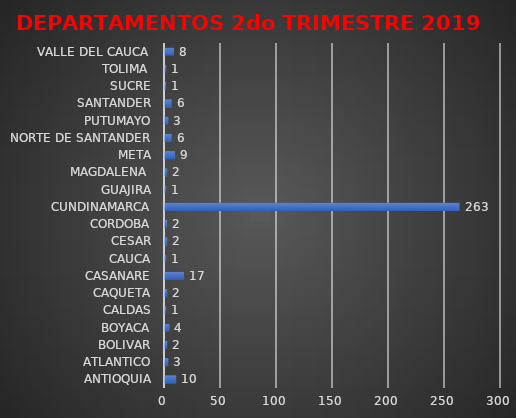
| Category | Series 0 |
|---|---|
| ANTIOQUIA | 10 |
| ATLANTICO | 3 |
| BOLIVAR | 2 |
| BOYACA | 4 |
| CALDAS | 1 |
| CAQUETA | 2 |
| CASANARE | 17 |
| CAUCA | 1 |
| CESAR | 2 |
| CORDOBA | 2 |
| CUNDINAMARCA | 263 |
| GUAJIRA | 1 |
| MAGDALENA  | 2 |
| META | 9 |
| NORTE DE SANTANDER | 6 |
| PUTUMAYO | 3 |
| SANTANDER | 6 |
| SUCRE | 1 |
| TOLIMA  | 1 |
| VALLE DEL CAUCA  | 8 |